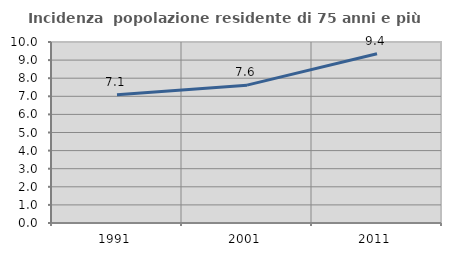
| Category | Incidenza  popolazione residente di 75 anni e più |
|---|---|
| 1991.0 | 7.089 |
| 2001.0 | 7.617 |
| 2011.0 | 9.355 |